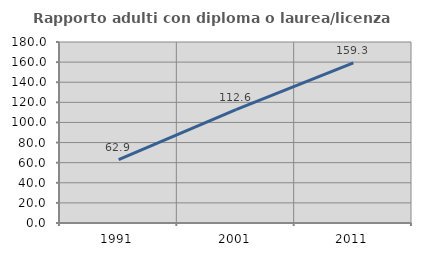
| Category | Rapporto adulti con diploma o laurea/licenza media  |
|---|---|
| 1991.0 | 62.939 |
| 2001.0 | 112.647 |
| 2011.0 | 159.322 |